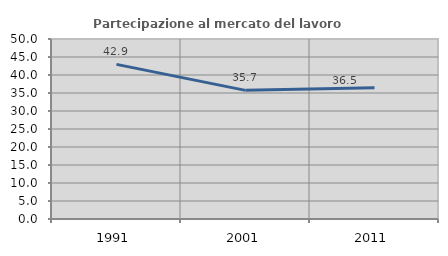
| Category | Partecipazione al mercato del lavoro  femminile |
|---|---|
| 1991.0 | 42.945 |
| 2001.0 | 35.733 |
| 2011.0 | 36.479 |